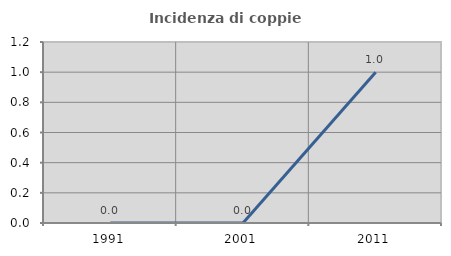
| Category | Incidenza di coppie miste |
|---|---|
| 1991.0 | 0 |
| 2001.0 | 0 |
| 2011.0 | 1 |